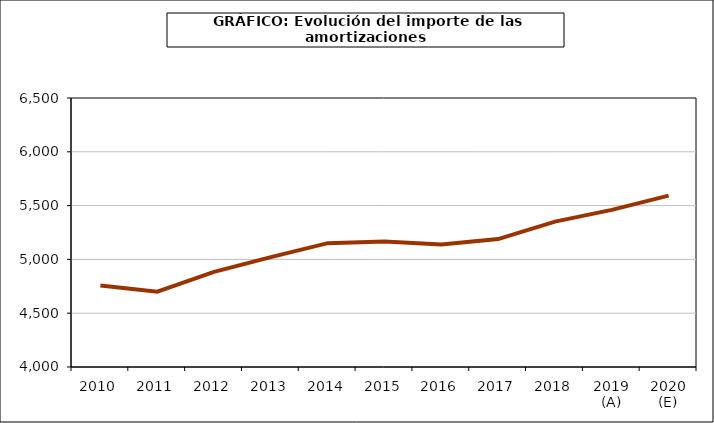
| Category | amortizacion |
|---|---|
| 2010 | 4758.255 |
| 2011 | 4699.859 |
| 2012 | 4884.543 |
| 2013 | 5021.523 |
| 2014 | 5151.042 |
| 2015 | 5167.348 |
| 2016 | 5137.515 |
| 2017 | 5189.174 |
| 2018 | 5351.475 |
| 2019 (A) | 5460.646 |
| 2020 (E) | 5592.523 |